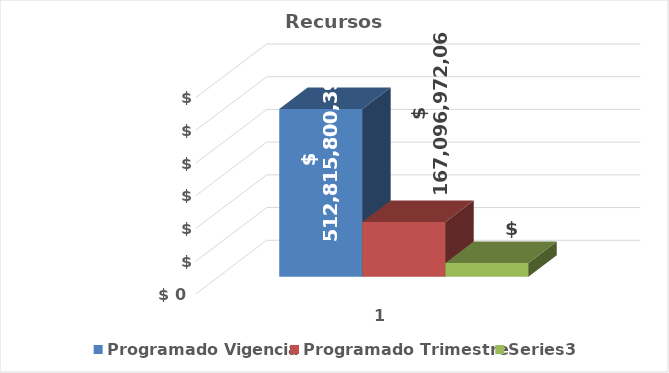
| Category | Programado Vigencia | Programado Trimestre | Series 2 |
|---|---|---|---|
| 0 | 512815800392 | 167096972062.87 | 41811111019.46 |